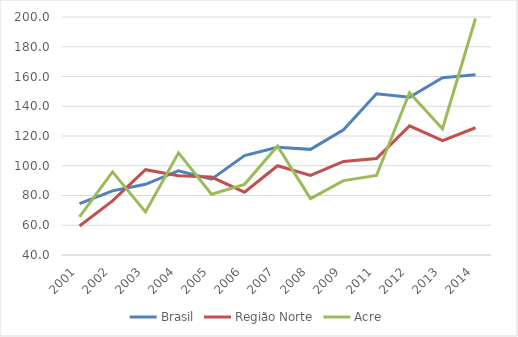
| Category | Brasil | Região Norte | Acre |
|---|---|---|---|
| 2001.0 | 74.53 | 59.521 | 65.571 |
| 2002.0 | 83.092 | 76.341 | 95.873 |
| 2003.0 | 87.545 | 97.373 | 68.968 |
| 2004.0 | 96.651 | 93.349 | 108.696 |
| 2005.0 | 90.93 | 92.425 | 80.853 |
| 2006.0 | 106.812 | 82.229 | 87.499 |
| 2007.0 | 112.466 | 100.028 | 113.327 |
| 2008.0 | 111.013 | 93.466 | 77.87 |
| 2009.0 | 124.225 | 102.915 | 90.009 |
| 2011.0 | 148.383 | 104.804 | 93.488 |
| 2012.0 | 146.057 | 126.788 | 149.132 |
| 2013.0 | 159.169 | 116.842 | 124.857 |
| 2014.0 | 161.157 | 125.537 | 199.017 |